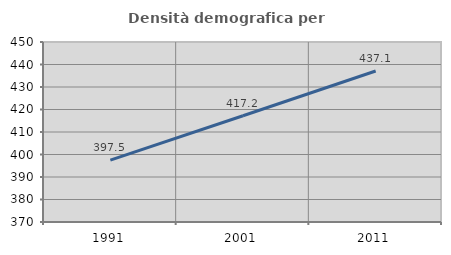
| Category | Densità demografica |
|---|---|
| 1991.0 | 397.498 |
| 2001.0 | 417.207 |
| 2011.0 | 437.123 |